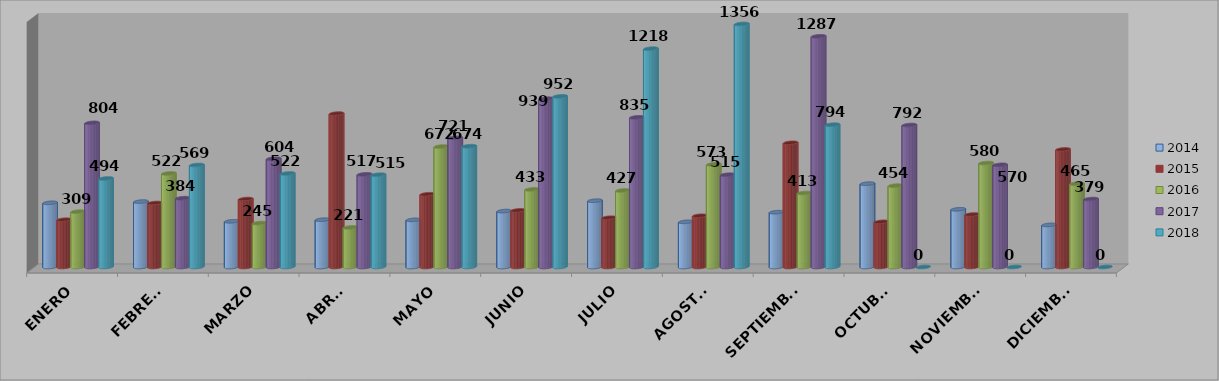
| Category | 2014 | 2015 | 2016 | 2017 | 2018 |
|---|---|---|---|---|---|
| ENERO | 358 | 264 | 309 | 804 | 494 |
| FEBRERO | 365 | 357 | 522 | 384 | 569 |
| MARZO | 255 | 379 | 245 | 604 | 522 |
| ABRIL | 264 | 856 | 221 | 517 | 515 |
| MAYO | 263 | 406 | 672 | 721 | 674 |
| JUNIO | 312 | 316 | 433 | 939 | 952 |
| JULIO | 370 | 275 | 427 | 835 | 1218 |
| AGOSTO | 252 | 286 | 573 | 515 | 1356 |
| SEPTIEMBRE | 306 | 693 | 413 | 1287 | 794 |
| OCTUBRE | 465 | 252 | 454 | 792 | 0 |
| NOVIEMBRE | 322 | 293 | 580 | 570 | 0 |
| DICIEMBRE | 235 | 656 | 465 | 379 | 0 |